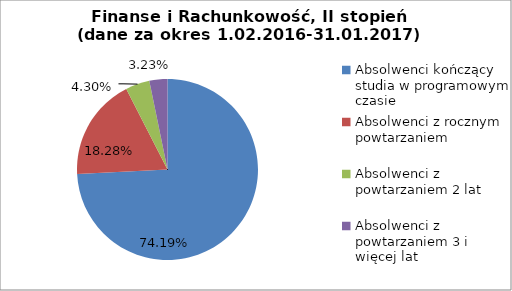
| Category | Series 0 |
|---|---|
| Absolwenci kończący studia w programowym czasie | 74.194 |
| Absolwenci z rocznym powtarzaniem | 18.28 |
| Absolwenci z powtarzaniem 2 lat | 4.301 |
| Absolwenci z powtarzaniem 3 i więcej lat | 3.226 |